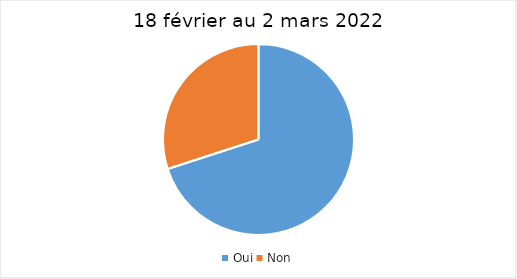
| Category | 18 février au 2 mars 2022 |
|---|---|
| Oui | 70 |
| Non | 30 |